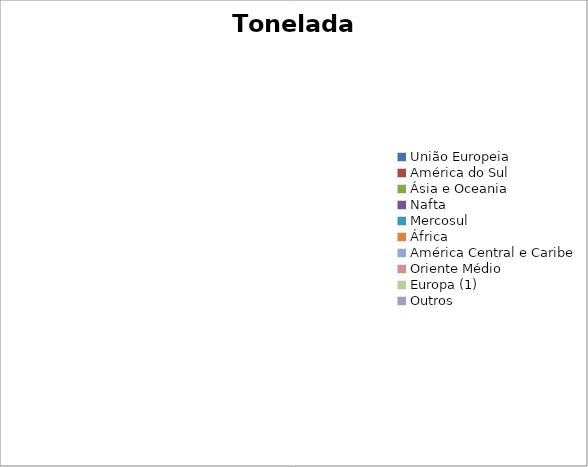
| Category | Series 0 |
|---|---|
| União Europeia | 0 |
| América do Sul | 0 |
| Ásia e Oceania | 0 |
| Nafta | 0 |
| Mercosul | 0 |
| África | 0 |
| América Central e Caribe | 0 |
| Oriente Médio | 0 |
| Europa (1) | 0 |
| Outros | 0 |